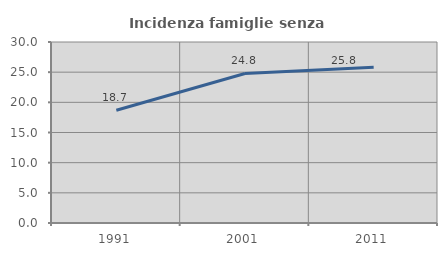
| Category | Incidenza famiglie senza nuclei |
|---|---|
| 1991.0 | 18.697 |
| 2001.0 | 24.782 |
| 2011.0 | 25.835 |